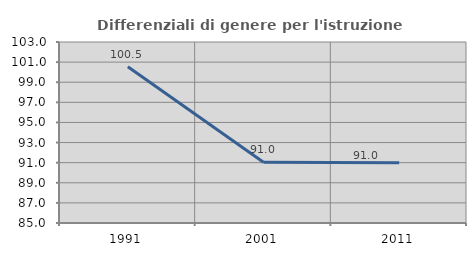
| Category | Differenziali di genere per l'istruzione superiore |
|---|---|
| 1991.0 | 100.531 |
| 2001.0 | 91.041 |
| 2011.0 | 90.993 |